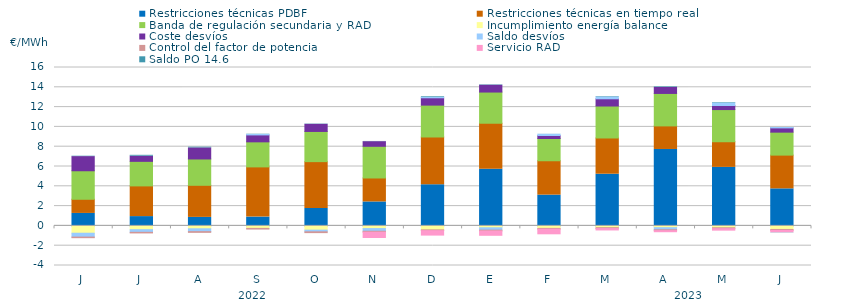
| Category | Restricciones técnicas PDBF | Restricciones técnicas en tiempo real | Banda de regulación secundaria y RAD | Incumplimiento energía balance | Coste desvíos | Saldo desvíos | Control del factor de potencia | Servicio RAD | Saldo PO 14.6 |
|---|---|---|---|---|---|---|---|---|---|
| J | 1.26 | 1.43 | 2.88 | -0.74 | 1.43 | -0.39 | -0.06 | 0 | 0.04 |
| J | 0.94 | 3.1 | 2.48 | -0.38 | 0.52 | -0.27 | -0.06 | 0 | 0.09 |
| A | 0.86 | 3.24 | 2.66 | -0.29 | 1.12 | -0.29 | -0.07 | 0 | 0.07 |
| S | 0.89 | 5.07 | 2.53 | -0.25 | 0.7 | 0.04 | -0.07 | 0 | 0.03 |
| O | 1.76 | 4.73 | 3.05 | -0.43 | 0.72 | -0.17 | -0.08 | 0 | 0.03 |
| N | 2.42 | 2.42 | 3.2 | -0.27 | 0.47 | -0.27 | -0.09 | -0.64 | 0.02 |
| D | 4.16 | 4.82 | 3.22 | -0.4 | 0.74 | 0.03 | -0.08 | -0.55 | 0.07 |
| E | 5.73 | 4.64 | 3.15 | -0.19 | 0.69 | -0.24 | -0.08 | -0.54 | 0.04 |
| F | 3.11 | 3.47 | 2.25 | -0.25 | 0.3 | 0.12 | -0.08 | -0.57 | 0.01 |
| M | 5.22 | 3.66 | 3.23 | -0.18 | 0.73 | 0.17 | -0.09 | -0.24 | 0.05 |
| A | 7.72 | 2.38 | 3.28 | -0.18 | 0.6 | -0.21 | -0.09 | -0.21 | 0.06 |
| M | 5.91 | 2.59 | 3.25 | -0.19 | 0.41 | 0.25 | -0.09 | -0.25 | 0.05 |
| J | 3.74 | 3.41 | 2.32 | -0.36 | 0.43 | 0.04 | -0.09 | -0.25 | -0.02 |